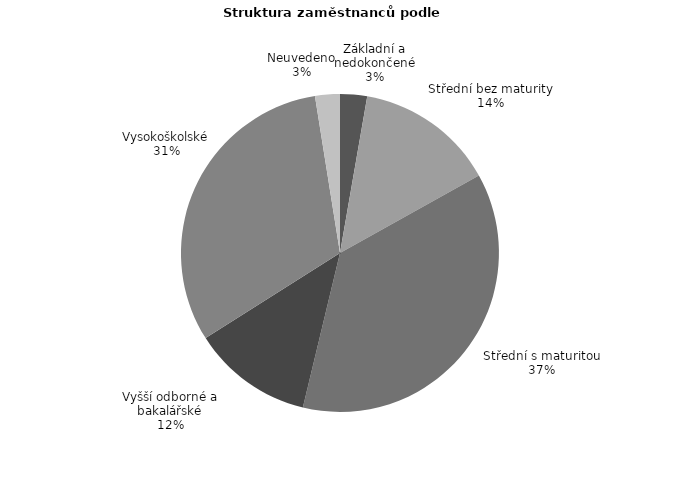
| Category | Series 0 |
|---|---|
| Základní a nedokončené | 18.463 |
| Střední bez maturity | 95.204 |
| Střední s maturitou | 247.646 |
| Vyšší odborné a bakalářské | 82.467 |
| Vysokoškolské | 211.475 |
| Neuvedeno | 16.945 |